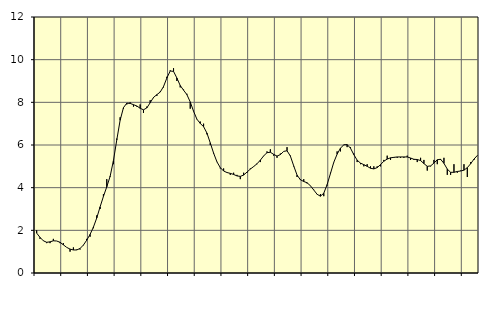
| Category | Piggar | Series 1 |
|---|---|---|
| nan | 2 | 1.87 |
| 87.0 | 1.6 | 1.67 |
| 87.0 | 1.5 | 1.51 |
| 87.0 | 1.4 | 1.44 |
| nan | 1.4 | 1.46 |
| 88.0 | 1.6 | 1.51 |
| 88.0 | 1.5 | 1.5 |
| 88.0 | 1.4 | 1.44 |
| nan | 1.4 | 1.32 |
| 89.0 | 1.2 | 1.2 |
| 89.0 | 1 | 1.12 |
| 89.0 | 1.2 | 1.08 |
| nan | 1.1 | 1.08 |
| 90.0 | 1.1 | 1.15 |
| 90.0 | 1.3 | 1.31 |
| 90.0 | 1.6 | 1.54 |
| nan | 1.7 | 1.81 |
| 91.0 | 2.1 | 2.15 |
| 91.0 | 2.7 | 2.58 |
| 91.0 | 3 | 3.1 |
| nan | 3.7 | 3.59 |
| 92.0 | 4.4 | 4.04 |
| 92.0 | 4.5 | 4.53 |
| 92.0 | 5.1 | 5.27 |
| nan | 6.3 | 6.24 |
| 93.0 | 7.3 | 7.16 |
| 93.0 | 7.7 | 7.75 |
| 93.0 | 7.9 | 7.96 |
| nan | 8 | 7.95 |
| 94.0 | 7.8 | 7.89 |
| 94.0 | 7.8 | 7.83 |
| 94.0 | 7.9 | 7.72 |
| nan | 7.5 | 7.65 |
| 95.0 | 7.8 | 7.74 |
| 95.0 | 8.1 | 7.98 |
| 95.0 | 8.2 | 8.23 |
| nan | 8.3 | 8.36 |
| 96.0 | 8.5 | 8.48 |
| 96.0 | 8.7 | 8.74 |
| 96.0 | 9.2 | 9.14 |
| nan | 9.5 | 9.47 |
| 97.0 | 9.6 | 9.45 |
| 97.0 | 9 | 9.14 |
| 97.0 | 8.7 | 8.79 |
| nan | 8.6 | 8.57 |
| 98.0 | 8.4 | 8.36 |
| 98.0 | 7.7 | 8.02 |
| 98.0 | 7.6 | 7.58 |
| nan | 7.2 | 7.21 |
| 99.0 | 7.1 | 7.01 |
| 99.0 | 7 | 6.86 |
| 99.0 | 6.5 | 6.56 |
| nan | 6 | 6.1 |
| 0.0 | 5.6 | 5.62 |
| 0.0 | 5.2 | 5.21 |
| 0.0 | 4.9 | 4.94 |
| nan | 4.9 | 4.78 |
| 1.0 | 4.7 | 4.71 |
| 1.0 | 4.6 | 4.67 |
| 1.0 | 4.7 | 4.62 |
| nan | 4.6 | 4.55 |
| 2.0 | 4.4 | 4.53 |
| 2.0 | 4.7 | 4.59 |
| 2.0 | 4.7 | 4.73 |
| nan | 4.9 | 4.87 |
| 3.0 | 5 | 4.99 |
| 3.0 | 5.1 | 5.12 |
| 3.0 | 5.2 | 5.29 |
| nan | 5.5 | 5.49 |
| 4.0 | 5.7 | 5.64 |
| 4.0 | 5.8 | 5.66 |
| 4.0 | 5.5 | 5.56 |
| nan | 5.4 | 5.48 |
| 5.0 | 5.6 | 5.55 |
| 5.0 | 5.7 | 5.7 |
| 5.0 | 5.9 | 5.73 |
| nan | 5.5 | 5.48 |
| 6.0 | 5 | 5.02 |
| 6.0 | 4.5 | 4.59 |
| 6.0 | 4.4 | 4.37 |
| nan | 4.4 | 4.29 |
| 7.0 | 4.2 | 4.23 |
| 7.0 | 4.1 | 4.09 |
| 7.0 | 3.9 | 3.89 |
| nan | 3.7 | 3.69 |
| 8.0 | 3.7 | 3.6 |
| 8.0 | 3.6 | 3.74 |
| 8.0 | 4.1 | 4.14 |
| nan | 4.7 | 4.66 |
| 9.0 | 5.2 | 5.19 |
| 9.0 | 5.7 | 5.57 |
| 9.0 | 5.7 | 5.85 |
| nan | 6 | 6.01 |
| 10.0 | 5.9 | 6.02 |
| 10.0 | 5.9 | 5.85 |
| 10.0 | 5.6 | 5.55 |
| nan | 5.2 | 5.29 |
| 11.0 | 5.1 | 5.15 |
| 11.0 | 5 | 5.08 |
| 11.0 | 5.1 | 5 |
| nan | 5 | 4.91 |
| 12.0 | 5 | 4.88 |
| 12.0 | 5 | 4.94 |
| 12.0 | 5 | 5.08 |
| nan | 5.3 | 5.24 |
| 13.0 | 5.5 | 5.34 |
| 13.0 | 5.3 | 5.4 |
| 13.0 | 5.4 | 5.42 |
| nan | 5.4 | 5.44 |
| 14.0 | 5.4 | 5.44 |
| 14.0 | 5.4 | 5.44 |
| 14.0 | 5.5 | 5.44 |
| nan | 5.3 | 5.39 |
| 15.0 | 5.3 | 5.33 |
| 15.0 | 5.2 | 5.32 |
| 15.0 | 5.4 | 5.27 |
| nan | 5.3 | 5.13 |
| 16.0 | 4.8 | 5 |
| 16.0 | 5 | 5.02 |
| 16.0 | 5.3 | 5.15 |
| nan | 5.1 | 5.31 |
| 17.0 | 5.3 | 5.33 |
| 17.0 | 5.4 | 5.14 |
| 17.0 | 4.6 | 4.87 |
| nan | 4.6 | 4.72 |
| 18.0 | 5.1 | 4.72 |
| 18.0 | 4.7 | 4.76 |
| 18.0 | 4.8 | 4.78 |
| nan | 5.1 | 4.82 |
| 19.0 | 4.5 | 4.94 |
| 19.0 | 5.2 | 5.12 |
| 19.0 | 5.3 | 5.34 |
| nan | 5.5 | 5.51 |